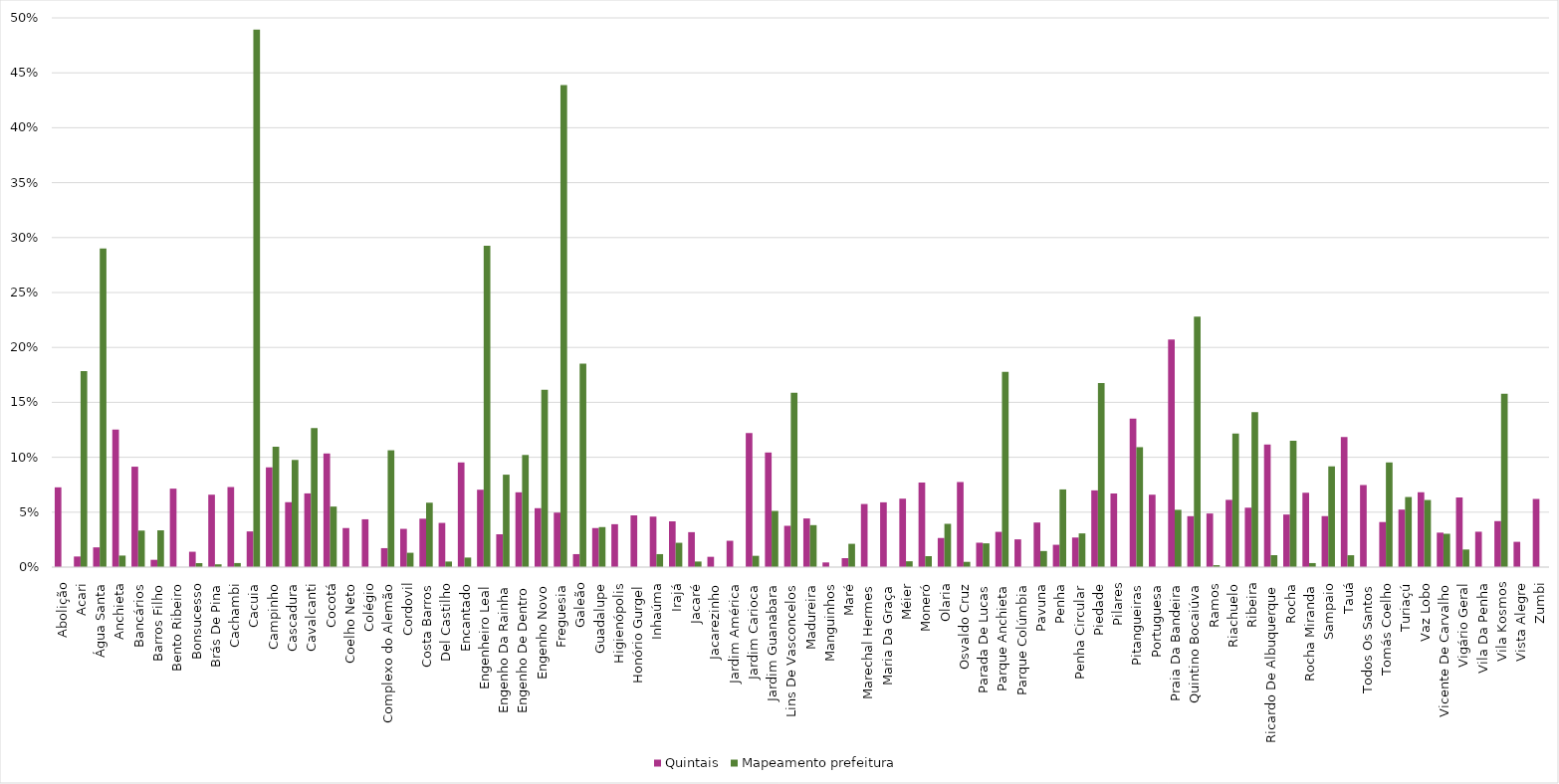
| Category | Quintais | Mapeamento prefeitura |
|---|---|---|
| Abolição | 0.073 | 0 |
| Acari | 0.01 | 0.179 |
| Água Santa | 0.018 | 0.29 |
| Anchieta | 0.125 | 0.011 |
| Bancários | 0.091 | 0.033 |
| Barros Filho | 0.007 | 0.033 |
| Bento Ribeiro | 0.071 | 0 |
| Bonsucesso | 0.014 | 0.004 |
| Brás De Pina | 0.066 | 0.003 |
| Cachambi | 0.073 | 0.004 |
| Cacuia | 0.032 | 0.489 |
| Campinho | 0.091 | 0.11 |
| Cascadura | 0.059 | 0.098 |
| Cavalcanti | 0.067 | 0.127 |
| Cocotá | 0.103 | 0.055 |
| Coelho Neto | 0.036 | 0 |
| Colégio | 0.044 | 0 |
| Complexo do Alemão | 0.017 | 0.106 |
| Cordovil | 0.035 | 0.013 |
| Costa Barros | 0.044 | 0.059 |
| Del Castilho | 0.04 | 0.005 |
| Encantado | 0.095 | 0.009 |
| Engenheiro Leal | 0.07 | 0.293 |
| Engenho Da Rainha | 0.03 | 0.084 |
| Engenho De Dentro | 0.068 | 0.102 |
| Engenho Novo | 0.054 | 0.161 |
| Freguesia | 0.05 | 0.439 |
| Galeão | 0.012 | 0.185 |
| Guadalupe | 0.036 | 0.036 |
| Higienópolis | 0.039 | 0 |
| Honório Gurgel | 0.047 | 0 |
| Inhaúma | 0.046 | 0.012 |
| Irajá | 0.042 | 0.022 |
| Jacaré | 0.032 | 0.005 |
| Jacarezinho | 0.009 | 0 |
| Jardim América | 0.024 | 0 |
| Jardim Carioca | 0.122 | 0.01 |
| Jardim Guanabara | 0.104 | 0.051 |
| Lins De Vasconcelos | 0.038 | 0.159 |
| Madureira | 0.044 | 0.038 |
| Manguinhos | 0.004 | 0 |
| Maré | 0.008 | 0.021 |
| Marechal Hermes | 0.057 | 0 |
| Maria Da Graça | 0.059 | 0 |
| Méier | 0.062 | 0.005 |
| Moneró | 0.077 | 0.01 |
| Olaria | 0.026 | 0.039 |
| Osvaldo Cruz | 0.077 | 0.005 |
| Parada De Lucas | 0.022 | 0.022 |
| Parque Anchieta | 0.032 | 0.178 |
| Parque Colúmbia | 0.025 | 0 |
| Pavuna | 0.041 | 0.015 |
| Penha | 0.02 | 0.071 |
| Penha Circular | 0.027 | 0.031 |
| Piedade | 0.07 | 0.168 |
| Pilares | 0.067 | 0 |
| Pitangueiras | 0.135 | 0.109 |
| Portuguesa | 0.066 | 0 |
| Praia Da Bandeira | 0.207 | 0.052 |
| Quintino Bocaiúva | 0.046 | 0.228 |
| Ramos | 0.049 | 0.002 |
| Riachuelo | 0.061 | 0.121 |
| Ribeira | 0.054 | 0.141 |
| Ricardo De Albuquerque | 0.112 | 0.011 |
| Rocha | 0.048 | 0.115 |
| Rocha Miranda | 0.068 | 0.004 |
| Sampaio | 0.046 | 0.092 |
| Tauá | 0.118 | 0.011 |
| Todos Os Santos | 0.075 | 0 |
| Tomás Coelho | 0.041 | 0.095 |
| Turiaçú | 0.052 | 0.064 |
| Vaz Lobo | 0.068 | 0.061 |
| Vicente De Carvalho | 0.031 | 0.03 |
| Vigário Geral | 0.063 | 0.016 |
| Vila Da Penha | 0.032 | 0 |
| Vila Kosmos | 0.042 | 0.158 |
| Vista Alegre | 0.023 | 0 |
| Zumbi | 0.062 | 0 |